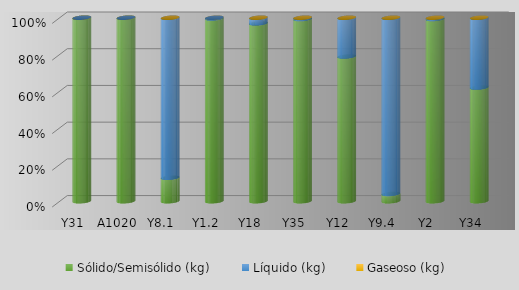
| Category | Sólido/Semisólido (kg) | Líquido (kg) | Gaseoso (kg) |
|---|---|---|---|
| Y31 | 4674211.26 | 0 | 0 |
| A1020 | 3477544.6 | 83.62 | 0 |
| Y8.1 | 136566.35 | 927887.59 | 230.8 |
| Y1.2 | 1059143.1 | 4170.9 | 0 |
| Y18 | 1015644.06 | 32120.83 | 0 |
| Y35 | 641253 | 4640.5 | 0 |
| Y12 | 429833.67 | 115152.8 | 10.5 |
| Y9.4 | 16596.5 | 398206.08 | 0 |
| Y2 | 383069.33 | 2655.1 | 0 |
| Y34 | 213484.74 | 131132.31 | 0 |